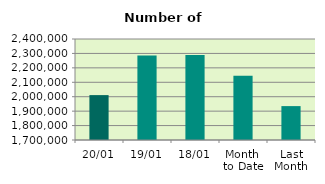
| Category | Series 0 |
|---|---|
| 20/01 | 2011176 |
| 19/01 | 2285152 |
| 18/01 | 2288568 |
| Month 
to Date | 2146124.4 |
| Last
Month | 1934937.048 |